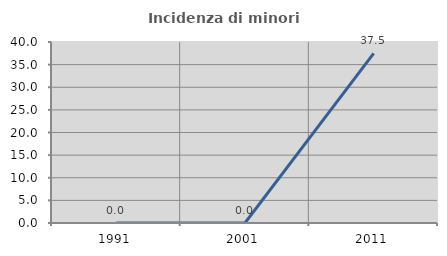
| Category | Incidenza di minori stranieri |
|---|---|
| 1991.0 | 0 |
| 2001.0 | 0 |
| 2011.0 | 37.5 |